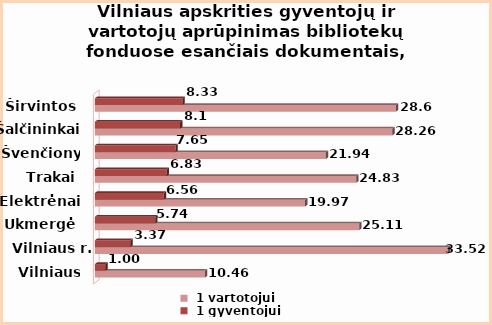
| Category | 1 vartotojui | 1 gyventojui |
|---|---|---|
| Vilniaus m. | 10.46 | 1 |
| Vilniaus r. | 33.52 | 3.37 |
| Ukmergė | 25.11 | 5.74 |
| Elektrėnai | 19.97 | 6.56 |
| Trakai | 24.83 | 6.83 |
| Švenčionys | 21.94 | 7.65 |
| Šalčininkai | 28.26 | 8.1 |
| Širvintos | 28.6 | 8.33 |